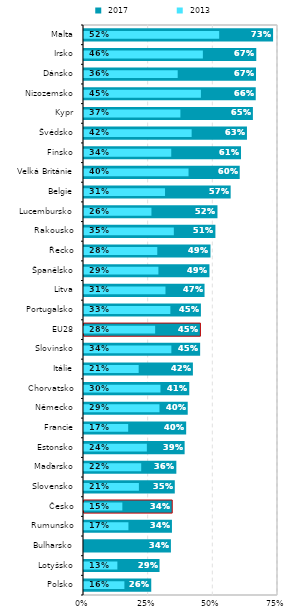
| Category |  2017 |
|---|---|
| Polsko | 0.26 |
| Lotyšsko | 0.292 |
| Bulharsko | 0.336 |
| Rumunsko | 0.34 |
| Česko | 0.341 |
| Slovensko | 0.351 |
| Maďarsko | 0.357 |
| Estonsko | 0.389 |
| Francie | 0.395 |
| Německo | 0.401 |
| Chorvatsko | 0.407 |
| Itálie | 0.421 |
| Slovinsko | 0.449 |
| EU28 | 0.45 |
| Portugalsko | 0.452 |
| Litva | 0.466 |
| Španělsko | 0.485 |
| Řecko | 0.489 |
| Rakousko | 0.508 |
| Lucembursko | 0.516 |
| Belgie | 0.567 |
| Velká Británie | 0.602 |
| Finsko | 0.607 |
| Švédsko | 0.63 |
| Kypr | 0.653 |
| Nizozemsko | 0.664 |
| Dánsko | 0.665 |
| Irsko | 0.666 |
| Malta | 0.731 |